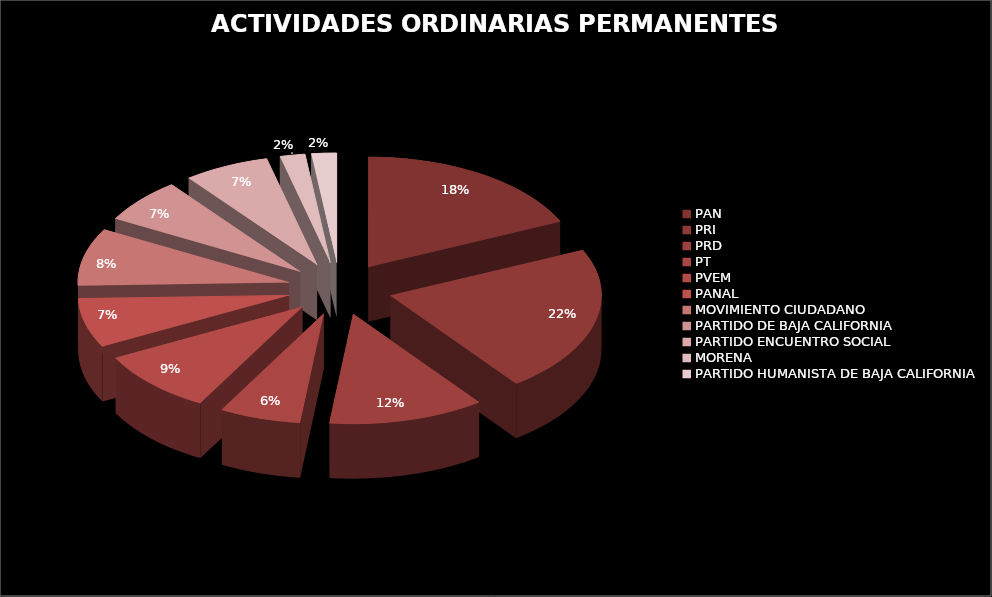
| Category | MONTO ANUAL |
|---|---|
| PAN | 23018040.84 |
| PRI | 27366424.34 |
| PRD | 15119097.55 |
| PT | 7883817.32 |
| PVEM | 11714254.27 |
| PANAL | 9160692.28 |
| MOVIMIENTO CIUDADANO | 10720262.89 |
| PARTIDO DE BAJA CALIFORNIA | 8309411 |
| PARTIDO ENCUENTRO SOCIAL | 8309411 |
| MORENA | 2432028.23 |
| PARTIDO HUMANISTA DE BAJA CALIFORNIA | 2432028.23 |